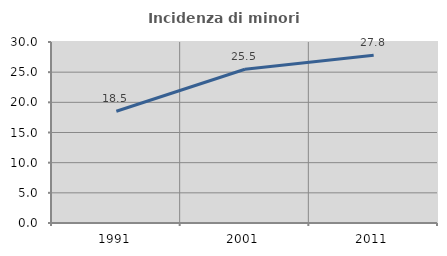
| Category | Incidenza di minori stranieri |
|---|---|
| 1991.0 | 18.519 |
| 2001.0 | 25.484 |
| 2011.0 | 27.817 |